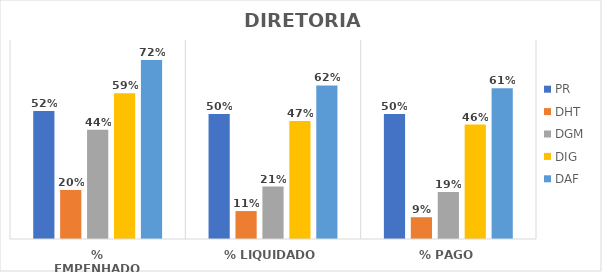
| Category | PR | DHT | DGM | DIG | DAF |
|---|---|---|---|---|---|
| % EMPENHADO | 0.515 | 0.197 | 0.439 | 0.586 | 0.72 |
| % LIQUIDADO | 0.503 | 0.112 | 0.211 | 0.475 | 0.617 |
| % PAGO | 0.503 | 0.088 | 0.189 | 0.46 | 0.606 |